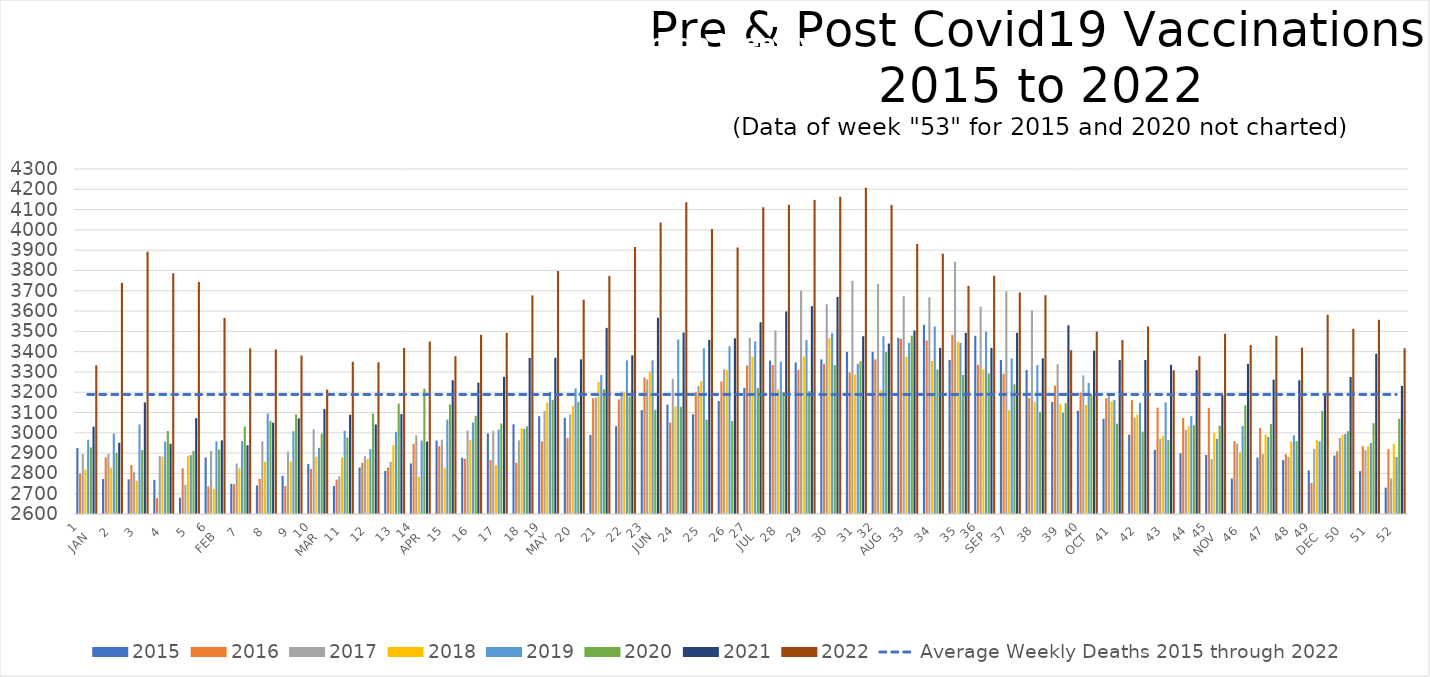
| Category | 2015 | 2016 | 2017 | 2018 | 2019 | 2020 | 2021 | 2022 |
|---|---|---|---|---|---|---|---|---|
| 1
JAN | 2925 | 2799 | 2895 | 2819 | 2966 | 2928 | 3030 | 3333 |
| 2 | 2772 | 2879 | 2897 | 2828 | 2997 | 2902 | 2951 | 3739 |
| 3 | 2771 | 2841 | 2806 | 2764 | 3041 | 2915 | 3150 | 3892 |
| 4 | 2768 | 2678 | 2887 | 2883 | 2957 | 3009 | 2946 | 3786 |
| 5 | 2680 | 2825 | 2745 | 2885 | 2890 | 2911 | 3072 | 3744 |
| 6
FEB | 2879 | 2736 | 2911 | 2724 | 2958 | 2918 | 2963 | 3566 |
| 7 | 2749 | 2747 | 2849 | 2825 | 2959 | 3031 | 2939 | 3416 |
| 8 | 2741 | 2773 | 2958 | 2857 | 3095 | 3059 | 3050 | 3411 |
| 9 | 2788 | 2738 | 2908 | 2858 | 3008 | 3091 | 3071 | 3381 |
| 10
MAR | 2846 | 2822 | 3017 | 2882 | 2926 | 2997 | 3118 | 3213 |
| 11 | 2738 | 2769 | 2785 | 2879 | 3010 | 2977 | 3089 | 3350 |
| 12 | 2829 | 2853 | 2885 | 2871 | 2920 | 3095 | 3041 | 3348 |
| 13 | 2812 | 2829 | 2858 | 2939 | 3005 | 3144 | 3092 | 3418 |
| 14
APR | 2849 | 2946 | 2988 | 2784 | 2962 | 3218 | 2957 | 3450 |
| 15 | 2962 | 2934 | 2966 | 2828 | 3065 | 3140 | 3259 | 3378 |
| 16 | 2877 | 2872 | 3011 | 2965 | 3051 | 3084 | 3247 | 3483 |
| 17 | 2997 | 2866 | 3010 | 2840 | 3016 | 3046 | 3276 | 3493 |
| 18 | 3042 | 2853 | 2963 | 3021 | 3020 | 3032 | 3369 | 3677 |
| 19
MAY | 3082 | 2958 | 3108 | 3148 | 3202 | 3162 | 3370 | 3797 |
| 20 | 3074 | 2975 | 3091 | 3133 | 3219 | 3153 | 3362 | 3656 |
| 21 | 2990 | 3170 | 3173 | 3252 | 3285 | 3214 | 3517 | 3773 |
| 22 | 3033 | 3164 | 3203 | 3199 | 3357 | 3178 | 3382 | 3916 |
| 23
JUN | 3112 | 3273 | 3263 | 3301 | 3357 | 3113 | 3567 | 4036 |
| 24 | 3139 | 3051 | 3266 | 3130 | 3460 | 3129 | 3494 | 4136 |
| 25 | 3091 | 3200 | 3232 | 3254 | 3416 | 3065 | 3458 | 4004 |
| 26 | 3157 | 3253 | 3313 | 3310 | 3427 | 3058 | 3466 | 3913 |
| 27
JUL | 3222 | 3332 | 3468 | 3375 | 3451 | 3221 | 3545 | 4112 |
| 28 | 3356 | 3334 | 3504 | 3214 | 3351 | 3201 | 3598 | 4124 |
| 29 | 3347 | 3310 | 3700 | 3376 | 3457 | 3205 | 3624 | 4147 |
| 30 | 3362 | 3339 | 3634 | 3467 | 3491 | 3334 | 3670 | 4163 |
| 31 | 3399 | 3298 | 3749 | 3287 | 3340 | 3353 | 3476 | 4208 |
| 32
AUG | 3399 | 3362 | 3734 | 3209 | 3476 | 3399 | 3440 | 4122 |
| 33 | 3468 | 3463 | 3673 | 3375 | 3443 | 3479 | 3504 | 3930 |
| 34 | 3532 | 3455 | 3668 | 3354 | 3524 | 3312 | 3419 | 3882 |
| 35 | 3359 | 3483 | 3843 | 3449 | 3443 | 3285 | 3493 | 3724 |
| 36
SEP | 3478 | 3336 | 3621 | 3313 | 3499 | 3293 | 3418 | 3774 |
| 37 | 3359 | 3291 | 3697 | 3111 | 3367 | 3239 | 3493 | 3692 |
| 38 | 3310 | 3172 | 3603 | 3152 | 3334 | 3102 | 3367 | 3678 |
| 39 | 3152 | 3232 | 3338 | 3143 | 3100 | 3146 | 3530 | 3407 |
| 40
OCT | 3109 | 3198 | 3283 | 3137 | 3246 | 3189 | 3405 | 3499 |
| 41 | 3069 | 3171 | 3184 | 3155 | 3162 | 3045 | 3359 | 3457 |
| 42 | 2991 | 3161 | 3075 | 3090 | 3148 | 3006 | 3359 | 3524 |
| 43 | 2916 | 3124 | 2971 | 2983 | 3150 | 2965 | 3335 | 3308 |
| 44 | 2899 | 3073 | 3015 | 3032 | 3082 | 3037 | 3309 | 3378 |
| 45
NOV | 2891 | 3123 | 2870 | 3000 | 2970 | 3035 | 3186 | 3488 |
| 46 | 2775 | 2959 | 2947 | 2903 | 3034 | 3136 | 3340 | 3433 |
| 47 | 2878 | 3024 | 2896 | 2991 | 2980 | 3044 | 3262 | 3478 |
| 48 | 2866 | 2895 | 2882 | 2957 | 2988 | 2959 | 3259 | 3420 |
| 49
DEC | 2815 | 2753 | 2921 | 2964 | 2958 | 3108 | 3195 | 3582 |
| 50 | 2888 | 2909 | 2975 | 2989 | 2994 | 3008 | 3275 | 3513 |
| 51 | 2811 | 2934 | 2914 | 2934 | 2950 | 3048 | 3390 | 3557 |
| 52 | 2730 | 2919 | 2775 | 2945 | 2881 | 3069 | 3231 | 3417 |